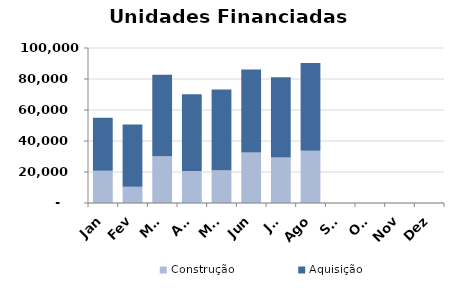
| Category | Construção | Aquisição  |
|---|---|---|
| Jan | 20845 | 34206 |
| Fev | 10499 | 40213 |
| Mar | 30238 | 52447 |
| Abr | 20667 | 49477 |
| Mai | 21176 | 51989 |
| Jun | 32589 | 53600 |
| Jul | 29380 | 51789 |
| Ago | 33710 | 56594 |
| Set | 0 | 0 |
| Out | 0 | 0 |
| Nov | 0 | 0 |
| Dez | 0 | 0 |